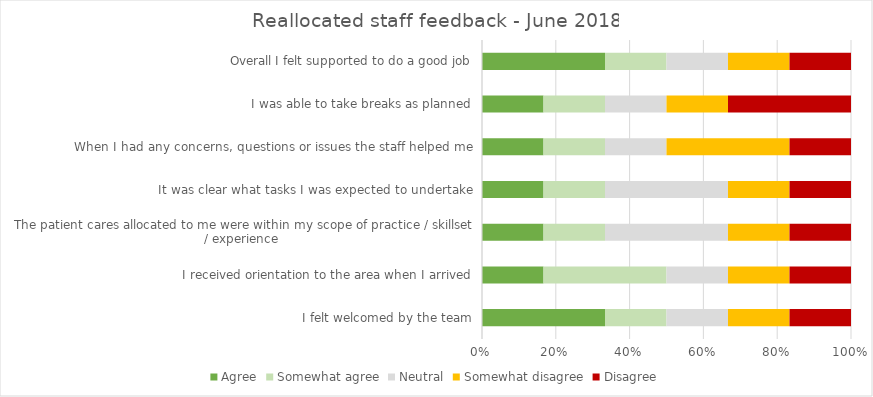
| Category | Agree | Somewhat agree | Neutral | Somewhat disagree | Disagree |
|---|---|---|---|---|---|
| I felt welcomed by the team | 2 | 1 | 1 | 1 | 1 |
| I received orientation to the area when I arrived | 1 | 2 | 1 | 1 | 1 |
| The patient cares allocated to me were within my scope of practice / skillset / experience  | 1 | 1 | 2 | 1 | 1 |
| It was clear what tasks I was expected to undertake | 1 | 1 | 2 | 1 | 1 |
| When I had any concerns, questions or issues the staff helped me | 1 | 1 | 1 | 2 | 1 |
| I was able to take breaks as planned | 1 | 1 | 1 | 1 | 2 |
| Overall I felt supported to do a good job | 2 | 1 | 1 | 1 | 1 |